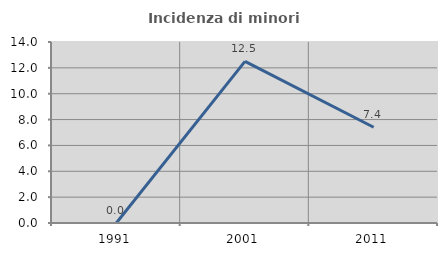
| Category | Incidenza di minori stranieri |
|---|---|
| 1991.0 | 0 |
| 2001.0 | 12.5 |
| 2011.0 | 7.407 |